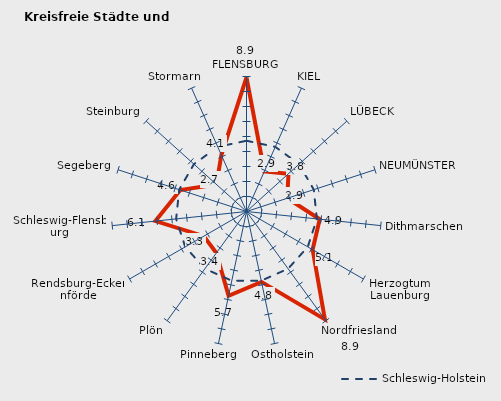
| Category | Kreise | Schleswig-Holstein |
|---|---|---|
| FLENSBURG | 8.949 | 4.717 |
| KIEL | 2.921 | 4.717 |
| LÜBECK | 3.766 | 4.717 |
| NEUMÜNSTER | 2.856 | 4.717 |
| Dithmarschen | 4.91 | 4.717 |
| Herzogtum Lauenburg | 5.09 | 4.717 |
| Nordfriesland | 8.894 | 4.717 |
| Ostholstein | 4.796 | 4.717 |
| Pinneberg | 5.748 | 4.717 |
| Plön | 3.42 | 4.717 |
| Rendsburg-Eckernförde | 3.288 | 4.717 |
| Schleswig-Flensburg | 6.104 | 4.717 |
| Segeberg | 4.641 | 4.717 |
| Steinburg | 2.695 | 4.717 |
| Stormarn | 4.12 | 4.717 |